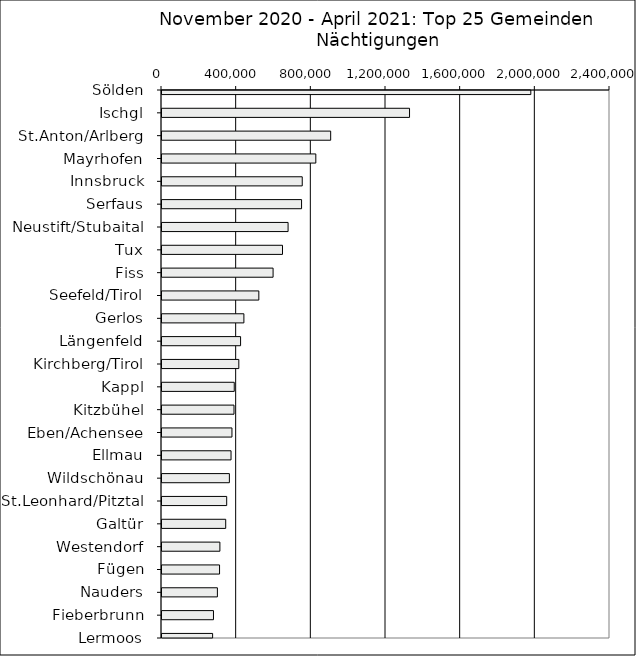
| Category | Series 0 |
|---|---|
| Sölden | 1975833 |
| Ischgl | 1326143 |
| St.Anton/Arlberg | 903670 |
| Mayrhofen | 824046 |
| Innsbruck | 751321 |
| Serfaus | 747678 |
| Neustift/Stubaital | 675486 |
| Tux | 645616 |
| Fiss | 595112 |
| Seefeld/Tirol | 518734 |
| Gerlos | 438760 |
| Längenfeld | 421021 |
| Kirchberg/Tirol | 411567 |
| Kappl | 387067 |
| Kitzbühel | 385772 |
| Eben/Achensee | 374823 |
| Ellmau | 369836 |
| Wildschönau | 360999 |
| St.Leonhard/Pitztal | 346555 |
| Galtür | 341296 |
| Westendorf | 310132 |
| Fügen | 308356 |
| Nauders | 296817 |
| Fieberbrunn | 275805 |
| Lermoos | 271154 |